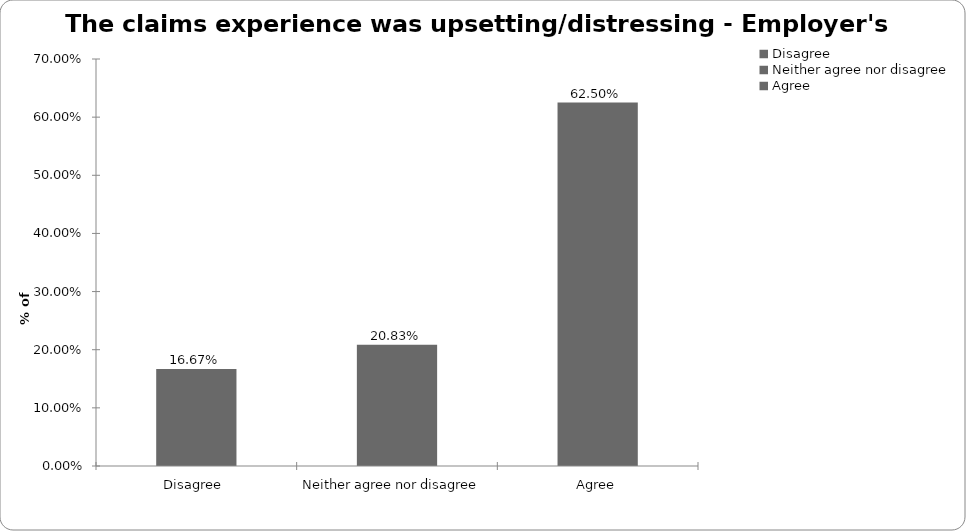
| Category | Employer's liability |
|---|---|
| Disagree  | 0.167 |
| Neither agree nor disagree  | 0.208 |
| Agree | 0.625 |